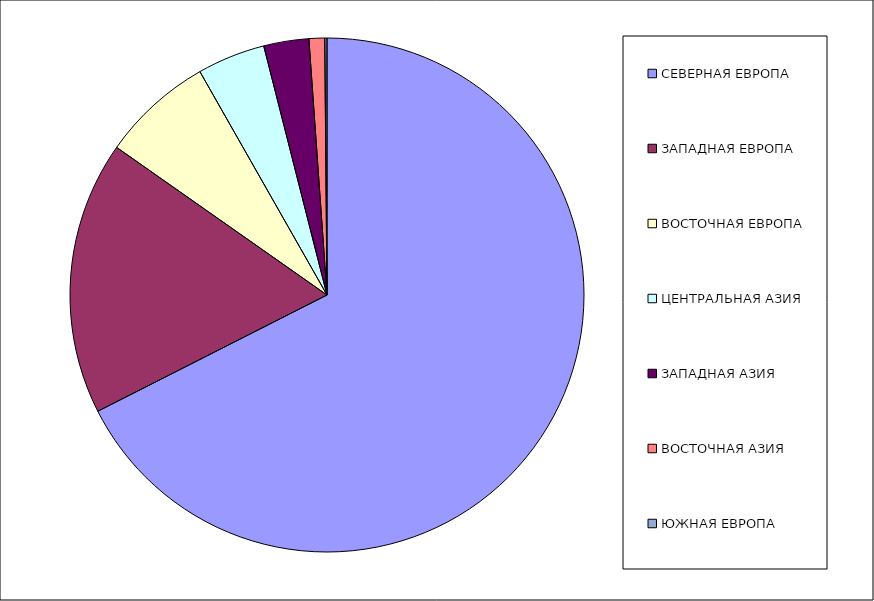
| Category | Оборот |
|---|---|
| СЕВЕРНАЯ ЕВРОПА | 67.528 |
| ЗАПАДНАЯ ЕВРОПА | 17.21 |
| ВОСТОЧНАЯ ЕВРОПА | 7.028 |
| ЦЕНТРАЛЬНАЯ АЗИЯ | 4.274 |
| ЗАПАДНАЯ АЗИЯ | 2.836 |
| ВОСТОЧНАЯ АЗИЯ | 0.985 |
| ЮЖНАЯ ЕВРОПА | 0.139 |